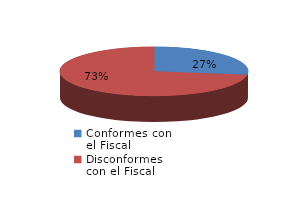
| Category | Series 0 |
|---|---|
| 0 | 51 |
| 1 | 136 |